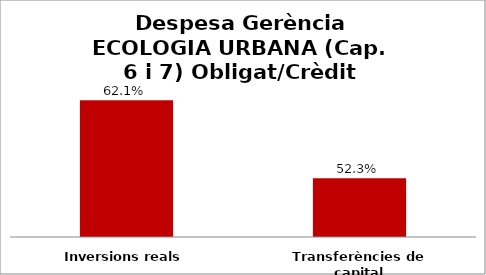
| Category | Series 0 |
|---|---|
| Inversions reals | 0.621 |
| Transferències de capital | 0.523 |